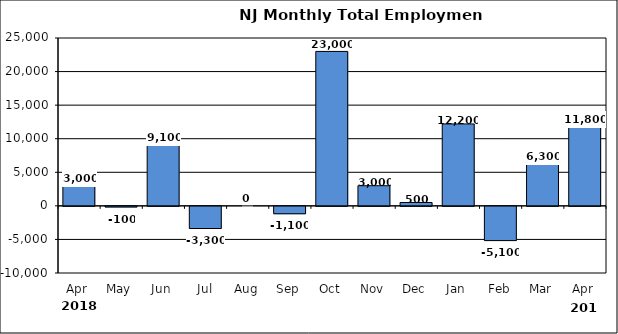
| Category | Series 0 |
|---|---|
| Apr | 3000 |
| May | -100 |
| Jun | 9100 |
| Jul | -3300 |
| Aug | 0 |
| Sep | -1100 |
| Oct | 23000 |
| Nov | 3000 |
| Dec | 500 |
| Jan | 12200 |
| Feb | -5100 |
| Mar | 6300 |
| Apr | 11800 |